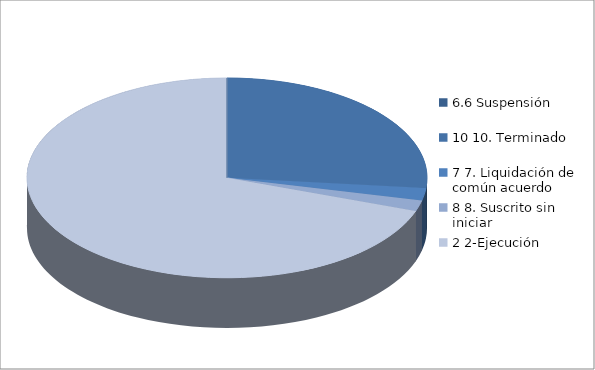
| Category | Series 0 |
|---|---|
| 6.6 Suspensión | 0 |
| 10 10. Terminado | 185 |
| 7 7. Liquidación de común acuerdo | 14 |
| 8 8. Suscrito sin iniciar | 12 |
| 2 2-Ejecución | 484 |